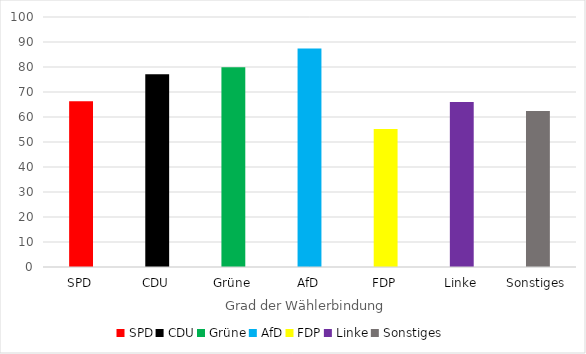
| Category | Series 0 |
|---|---|
| SPD | 66.3 |
| CDU | 77.1 |
| Grüne | 79.9 |
| AfD | 87.4 |
| FDP | 55.2 |
| Linke | 66 |
| Sonstiges | 62.4 |